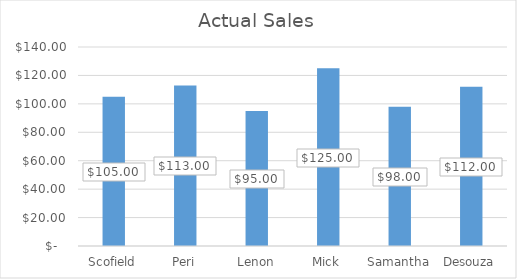
| Category | Actual Sales |
|---|---|
| Scofield | 105 |
| Peri | 113 |
| Lenon | 95 |
| Mick | 125 |
| Samantha | 98 |
| Desouza | 112 |